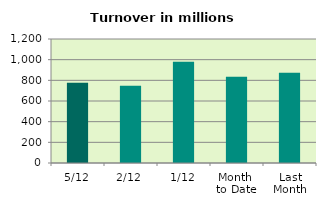
| Category | Series 0 |
|---|---|
| 5/12 | 777.065 |
| 2/12 | 748.761 |
| 1/12 | 979.99 |
| Month 
to Date | 835.272 |
| Last
Month | 874.327 |